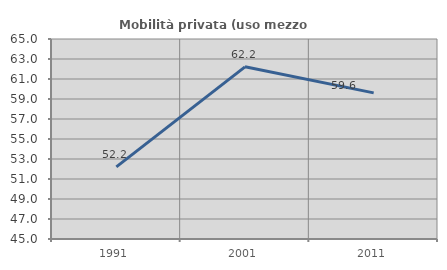
| Category | Mobilità privata (uso mezzo privato) |
|---|---|
| 1991.0 | 52.216 |
| 2001.0 | 62.216 |
| 2011.0 | 59.613 |